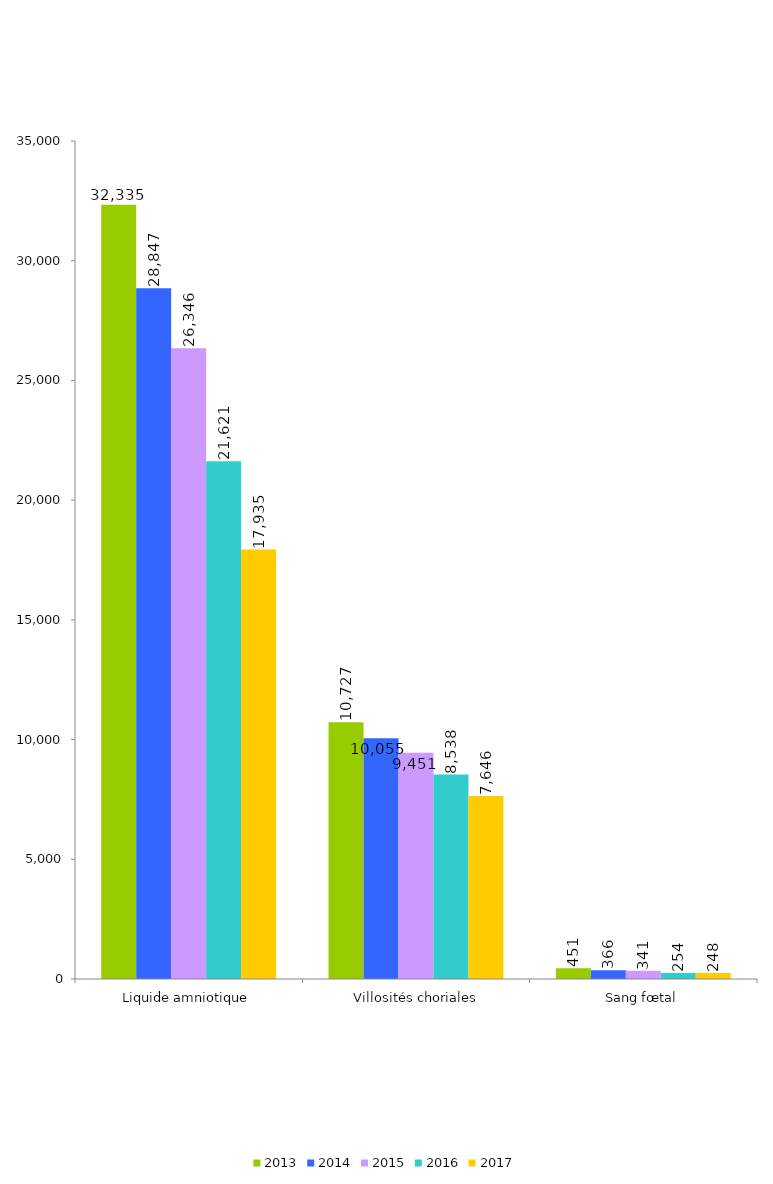
| Category | 2013 | 2014 | 2015 | 2016 | 2017 |
|---|---|---|---|---|---|
| Liquide amniotique | 32335 | 28847 | 26346 | 21621 | 17935 |
| Villosités choriales | 10727 | 10055 | 9451 | 8538 | 7646 |
| Sang fœtal | 451 | 366 | 341 | 254 | 248 |